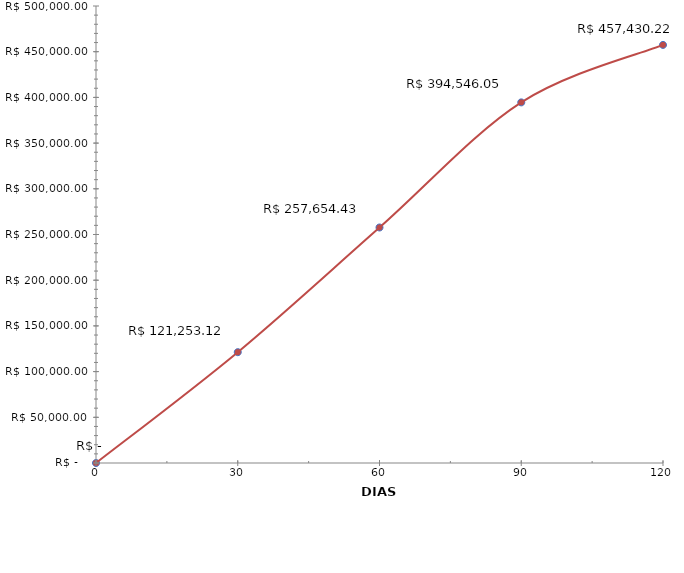
| Category | Series 0 |
|---|---|
| 0.0 | 0 |
| 30.0 | 121253.123 |
| 60.0 | 257654.428 |
| 90.0 | 394546.047 |
| 120.0 | 457430.218 |